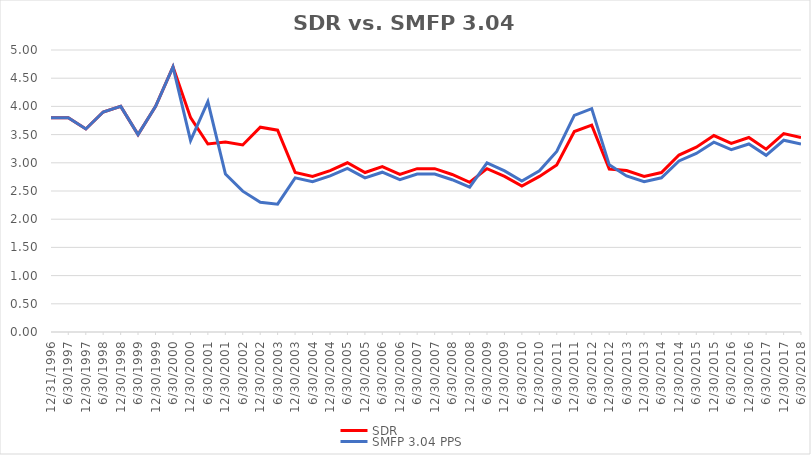
| Category | SDR | SMFP 3.04 PPS |
|---|---|---|
| 12/31/96 | 3.8 | 3.8 |
| 6/30/97 | 3.8 | 3.8 |
| 12/31/97 | 3.6 | 3.6 |
| 6/30/98 | 3.9 | 3.9 |
| 12/31/98 | 4 | 4 |
| 6/30/99 | 3.5 | 3.5 |
| 12/31/99 | 4 | 4 |
| 6/30/00 | 4.7 | 4.7 |
| 12/31/00 | 3.8 | 3.395 |
| 6/30/01 | 3.333 | 4.085 |
| 12/31/01 | 3.368 | 2.8 |
| 6/30/02 | 3.316 | 2.497 |
| 12/31/02 | 3.632 | 2.3 |
| 6/30/03 | 3.579 | 2.267 |
| 12/31/03 | 2.828 | 2.733 |
| 6/30/04 | 2.759 | 2.667 |
| 12/31/04 | 2.862 | 2.767 |
| 6/30/05 | 3 | 2.9 |
| 12/31/05 | 2.828 | 2.733 |
| 6/30/06 | 2.931 | 2.833 |
| 12/31/06 | 2.793 | 2.7 |
| 6/30/07 | 2.897 | 2.8 |
| 12/31/07 | 2.897 | 2.8 |
| 6/30/08 | 2.793 | 2.7 |
| 12/31/08 | 2.655 | 2.567 |
| 6/30/09 | 2.897 | 3 |
| 12/31/09 | 2.759 | 2.857 |
| 6/30/10 | 2.586 | 2.679 |
| 12/31/10 | 2.759 | 2.857 |
| 6/30/11 | 2.963 | 3.2 |
| 12/31/11 | 3.556 | 3.84 |
| 6/30/12 | 3.667 | 3.96 |
| 12/31/12 | 2.889 | 2.964 |
| 6/30/13 | 2.862 | 2.767 |
| 12/31/13 | 2.759 | 2.667 |
| 6/30/14 | 2.828 | 2.733 |
| 12/31/14 | 3.138 | 3.033 |
| 6/30/15 | 3.276 | 3.167 |
| 12/31/15 | 3.483 | 3.367 |
| 6/30/16 | 3.345 | 3.233 |
| 12/31/16 | 3.448 | 3.333 |
| 6/30/17 | 3.241 | 3.133 |
| 12/31/17 | 3.517 | 3.4 |
| 6/30/18 | 3.448 | 3.333 |